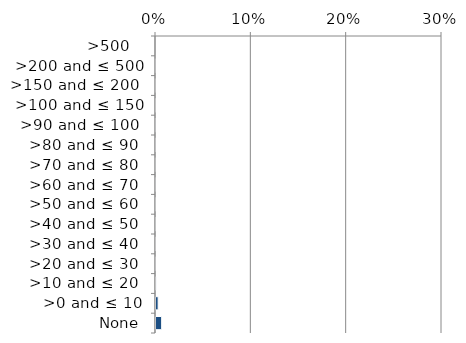
| Category | Near native & fragments |
|---|---|
|  None | 0.007 |
| >0 and ≤ 10 | 0.003 |
| >10 and ≤ 20  | 0.001 |
| >20 and ≤ 30  | 0 |
| >30 and ≤ 40  | 0.001 |
| >40 and ≤ 50  | 0 |
| >50 and ≤ 60  | 0 |
| >60 and ≤ 70  | 0 |
| >70 and ≤ 80  | 0 |
| >80 and ≤ 90  | 0 |
| >90 and ≤ 100  | 0 |
| >100 and ≤ 150 | 0 |
| >150 and ≤ 200  | 0 |
| >200 and ≤ 500 | 0 |
| >500   | 0 |